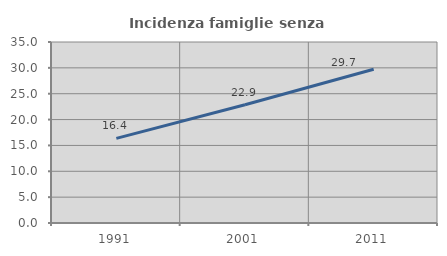
| Category | Incidenza famiglie senza nuclei |
|---|---|
| 1991.0 | 16.356 |
| 2001.0 | 22.862 |
| 2011.0 | 29.725 |